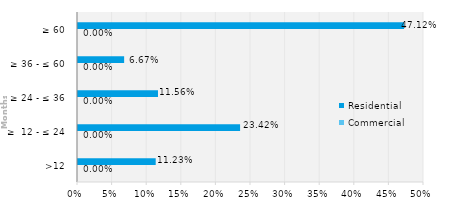
| Category | Commercial | Residential |
|---|---|---|
| >12 | 0 | 0.112 |
| ≥  12 - ≤ 24 | 0 | 0.234 |
| ≥ 24 - ≤ 36 | 0 | 0.116 |
| ≥ 36 - ≤ 60 | 0 | 0.067 |
| ≥ 60 | 0 | 0.471 |